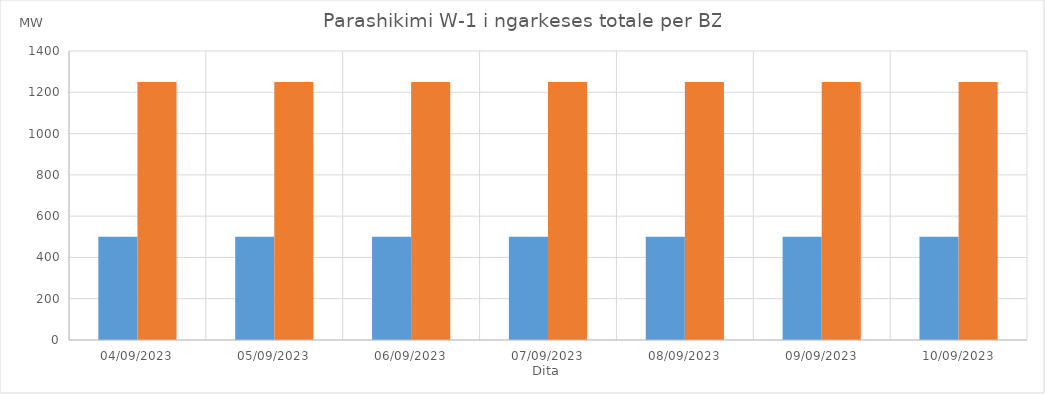
| Category | Min (MW) | Max (MW) |
|---|---|---|
| 04/09/2023 | 500 | 1250 |
| 05/09/2023 | 500 | 1250 |
| 06/09/2023 | 500 | 1250 |
| 07/09/2023 | 500 | 1250 |
| 08/09/2023 | 500 | 1250 |
| 09/09/2023 | 500 | 1250 |
| 10/09/2023 | 500 | 1250 |